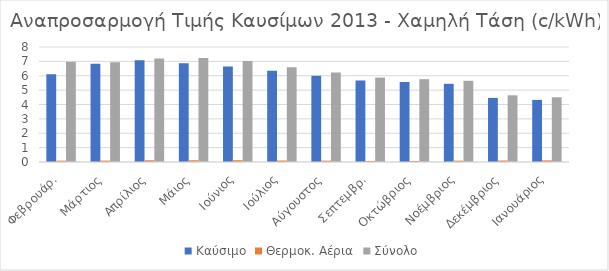
| Category | Καύσιμο | Θερμοκ. Αέρια | Σύνολο |
|---|---|---|---|
| Φεβρουάρ. | 6.108 | 0.093 | 6.972 |
| Μάρτιος | 6.834 | 0.098 | 6.94 |
| Απρίλιος | 7.081 | 0.12 | 7.208 |
| Μάιος | 6.873 | 0.12 | 7.234 |
| Ιούνιος | 6.645 | 0.124 | 7.019 |
| Ιούλιος | 6.344 | 0.104 | 6.6 |
| Αύγουστος | 6 | 0.094 | 6.233 |
| Σεπτεμβρ. | 5.672 | 0.075 | 5.873 |
| Οκτώβριος | 5.566 | 0.074 | 5.763 |
| Νοέμβριος | 5.441 | 0.092 | 5.649 |
| Δεκέμβριος | 4.459 | 0.104 | 4.64 |
| Ιανουάριος | 4.32 | 0.112 | 4.503 |